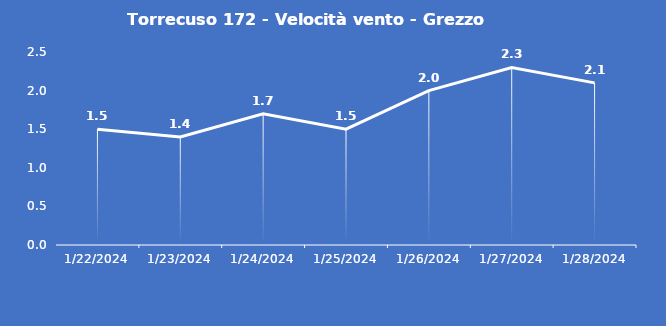
| Category | Torrecuso 172 - Velocità vento - Grezzo (m/s) |
|---|---|
| 1/22/24 | 1.5 |
| 1/23/24 | 1.4 |
| 1/24/24 | 1.7 |
| 1/25/24 | 1.5 |
| 1/26/24 | 2 |
| 1/27/24 | 2.3 |
| 1/28/24 | 2.1 |